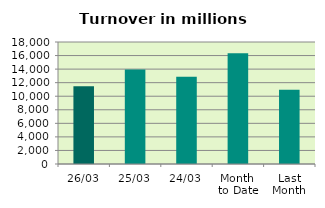
| Category | Series 0 |
|---|---|
| 26/03 | 11472.716 |
| 25/03 | 13926.077 |
| 24/03 | 12857.054 |
| Month 
to Date | 16354.253 |
| Last
Month | 10948.033 |